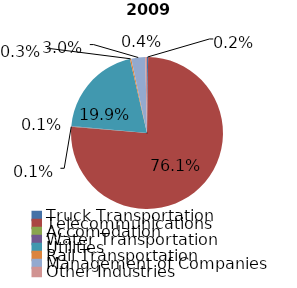
| Category | Series 0 |
|---|---|
| Truck Transportation | 1596638 |
| Telecommunications | 509600377 |
| Accomodation | 491874 |
| Water Transportation | 741161 |
| Utilities | 133454345 |
| Rail Transportation | 1944152 |
| Management of Companies | 19785223 |
| Other Industries | 2456059 |